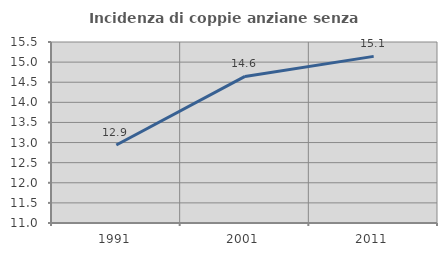
| Category | Incidenza di coppie anziane senza figli  |
|---|---|
| 1991.0 | 12.939 |
| 2001.0 | 14.645 |
| 2011.0 | 15.142 |